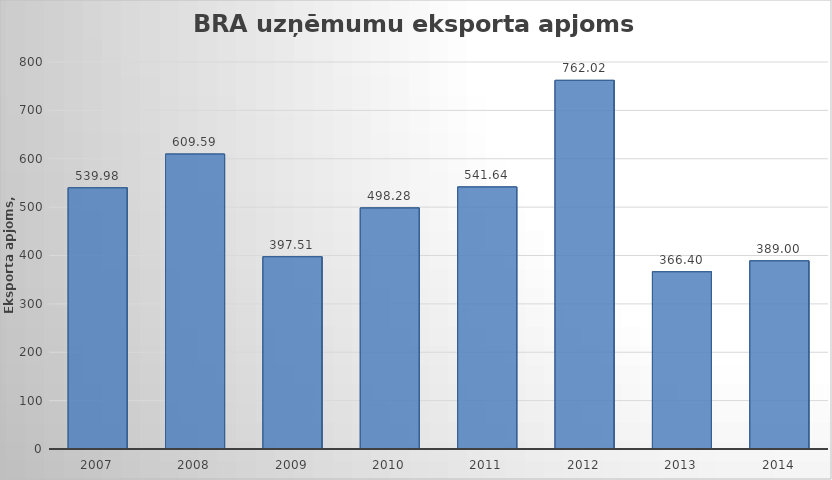
| Category | Series 0 |
|---|---|
| 2007.0 | 539.98 |
| 2008.0 | 609.59 |
| 2009.0 | 397.51 |
| 2010.0 | 498.28 |
| 2011.0 | 541.64 |
| 2012.0 | 762.02 |
| 2013.0 | 366.4 |
| 2014.0 | 389 |